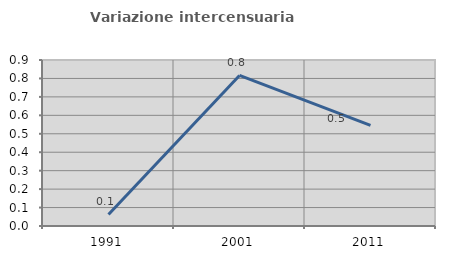
| Category | Variazione intercensuaria annua |
|---|---|
| 1991.0 | 0.063 |
| 2001.0 | 0.816 |
| 2011.0 | 0.545 |